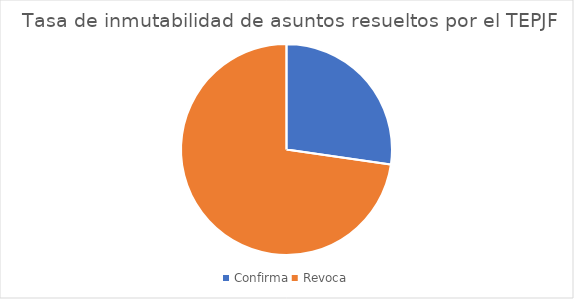
| Category | Tasa de inmutabilidad de asuntos resueltos por el TEPJF |
|---|---|
| Confirma | 3 |
| Revoca | 8 |